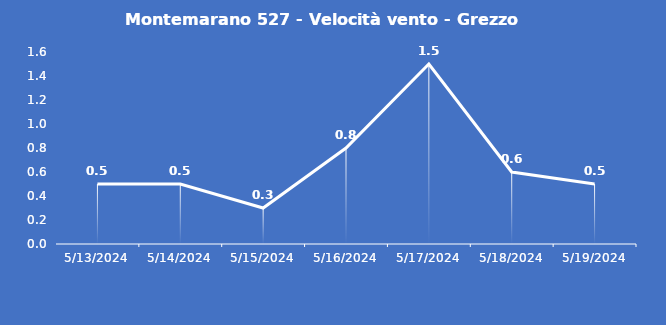
| Category | Montemarano 527 - Velocità vento - Grezzo (m/s) |
|---|---|
| 5/13/24 | 0.5 |
| 5/14/24 | 0.5 |
| 5/15/24 | 0.3 |
| 5/16/24 | 0.8 |
| 5/17/24 | 1.5 |
| 5/18/24 | 0.6 |
| 5/19/24 | 0.5 |